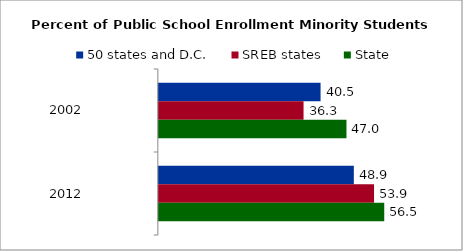
| Category | 50 states and D.C. | SREB states | State |
|---|---|---|---|
| 2002 | 40.545 | 36.279 | 47.039 |
| 2012 | 48.884 | 53.949 | 56.509 |